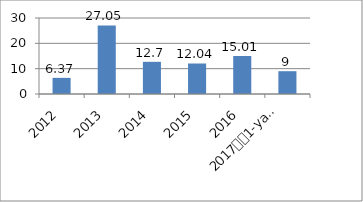
| Category | Series 0 |
|---|---|
| 2012 | 6.37 |
| 2013 | 27.05 |
| 2014 | 12.7 |
| 2015 | 12.04 |
| 2016 | 15.01 |
| 2017
1-yarim yillik | 9 |